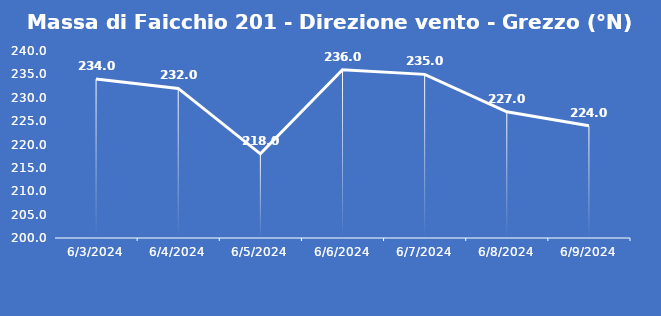
| Category | Massa di Faicchio 201 - Direzione vento - Grezzo (°N) |
|---|---|
| 6/3/24 | 234 |
| 6/4/24 | 232 |
| 6/5/24 | 218 |
| 6/6/24 | 236 |
| 6/7/24 | 235 |
| 6/8/24 | 227 |
| 6/9/24 | 224 |